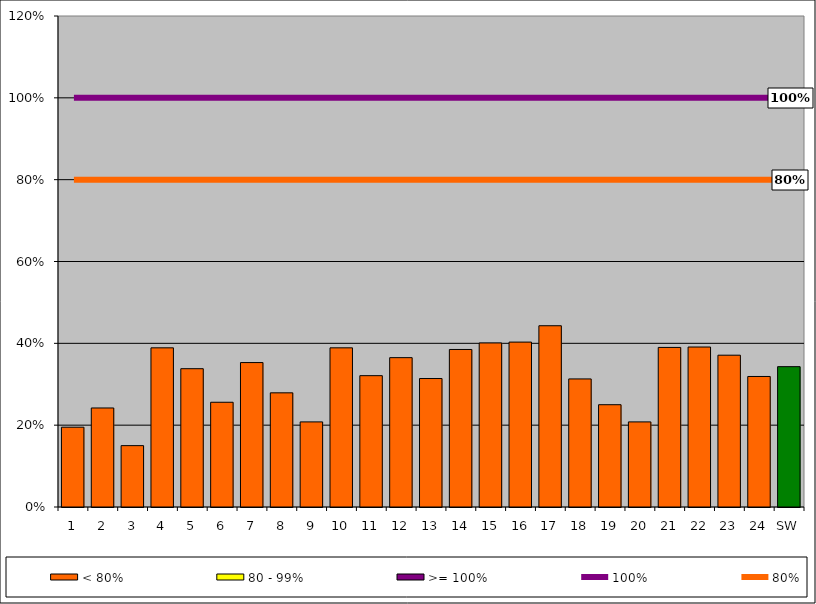
| Category | < 80% | 80 - 99% | >= 100% |
|---|---|---|---|
| 1 | 0.195 | 0 | 0 |
| 2 | 0.242 | 0 | 0 |
| 3 | 0.15 | 0 | 0 |
| 4 | 0.389 | 0 | 0 |
| 5 | 0.338 | 0 | 0 |
| 6 | 0.256 | 0 | 0 |
| 7 | 0.353 | 0 | 0 |
| 8 | 0.279 | 0 | 0 |
| 9 | 0.208 | 0 | 0 |
| 10 | 0.389 | 0 | 0 |
| 11 | 0.321 | 0 | 0 |
| 12 | 0.365 | 0 | 0 |
| 13 | 0.314 | 0 | 0 |
| 14 | 0.385 | 0 | 0 |
| 15 | 0.401 | 0 | 0 |
| 16 | 0.403 | 0 | 0 |
| 17 | 0.443 | 0 | 0 |
| 18 | 0.313 | 0 | 0 |
| 19 | 0.25 | 0 | 0 |
| 20 | 0.208 | 0 | 0 |
| 21 | 0.39 | 0 | 0 |
| 22 | 0.391 | 0 | 0 |
| 23 | 0.371 | 0 | 0 |
| 24 | 0.319 | 0 | 0 |
| SW | 0.343 | 0 | 0 |